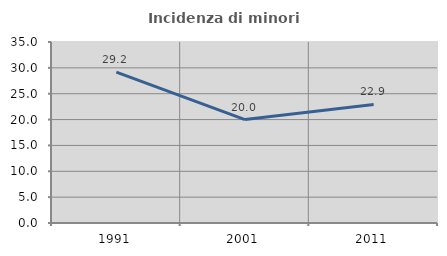
| Category | Incidenza di minori stranieri |
|---|---|
| 1991.0 | 29.167 |
| 2001.0 | 20 |
| 2011.0 | 22.917 |